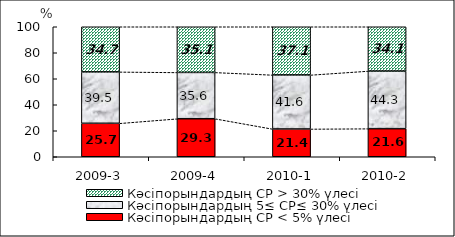
| Category | Кәсіпорындардың СР < 5% үлесі | Кәсіпорындардың 5≤ СР≤ 30% үлесі | Кәсіпорындардың СР > 30% үлесі |
|---|---|---|---|
| 2009-3 | 25.743 | 39.532 | 34.725 |
| 2009-4 | 29.26 | 35.611 | 35.129 |
| 2010-1 | 21.368 | 41.56 | 37.073 |
| 2010-2 | 21.622 | 44.324 | 34.054 |